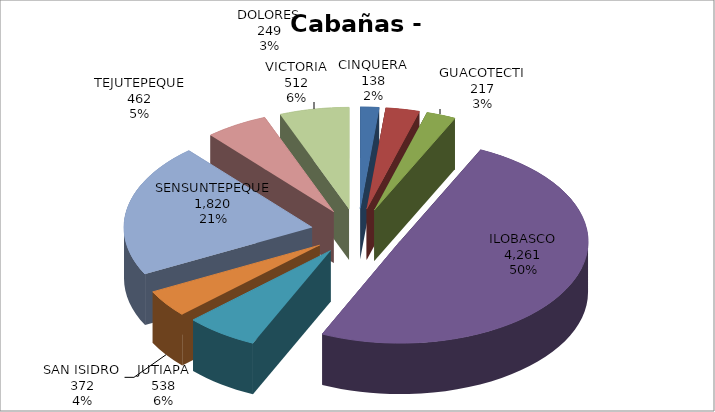
| Category | Series 0 |
|---|---|
| CINQUERA | 138 |
| DOLORES | 249 |
| GUACOTECTI | 217 |
| ILOBASCO | 4261 |
| JUTIAPA | 538 |
| SAN ISIDRO | 372 |
| SENSUNTEPEQUE | 1820 |
| TEJUTEPEQUE | 462 |
| VICTORIA | 512 |